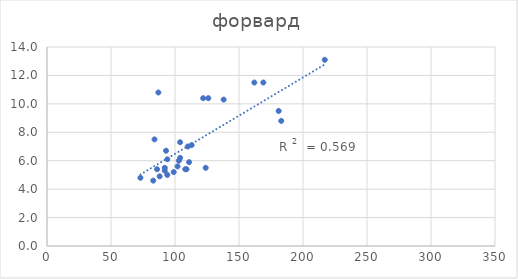
| Category | Series 0 |
|---|---|
| 217.0 | 13.1 |
| 183.0 | 8.8 |
| 181.0 | 9.5 |
| 169.0 | 11.5 |
| 162.0 | 11.5 |
| 138.0 | 10.3 |
| 126.0 | 10.4 |
| 124.0 | 5.5 |
| 122.0 | 10.4 |
| 113.0 | 7.1 |
| 111.0 | 5.9 |
| 110.0 | 7 |
| 109.0 | 5.4 |
| 108.0 | 5.4 |
| 104.0 | 6.2 |
| 104.0 | 7.3 |
| 103.0 | 6 |
| 102.0 | 5.6 |
| 99.0 | 5.2 |
| 94.0 | 5 |
| 94.0 | 6.1 |
| 93.0 | 6.7 |
| 92.0 | 5.3 |
| 92.0 | 5.5 |
| 88.0 | 4.9 |
| 87.0 | 10.8 |
| 86.0 | 5.4 |
| 84.0 | 7.5 |
| 83.0 | 4.6 |
| 73.0 | 4.8 |